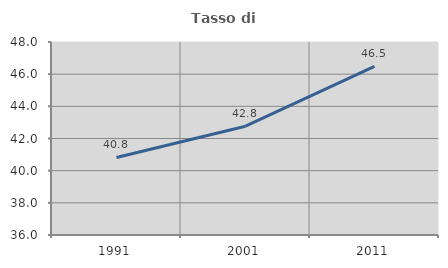
| Category | Tasso di occupazione   |
|---|---|
| 1991.0 | 40.822 |
| 2001.0 | 42.767 |
| 2011.0 | 46.491 |